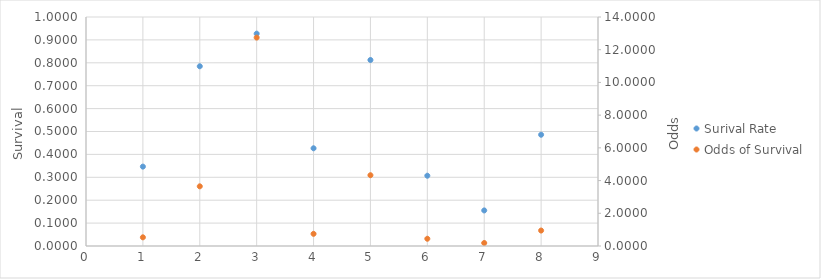
| Category | Surival Rate |
|---|---|
| 0 | 0.347 |
| 1 | 0.785 |
| 2 | 0.927 |
| 3 | 0.427 |
| 4 | 0.812 |
| 5 | 0.307 |
| 6 | 0.155 |
| 7 | 0.486 |